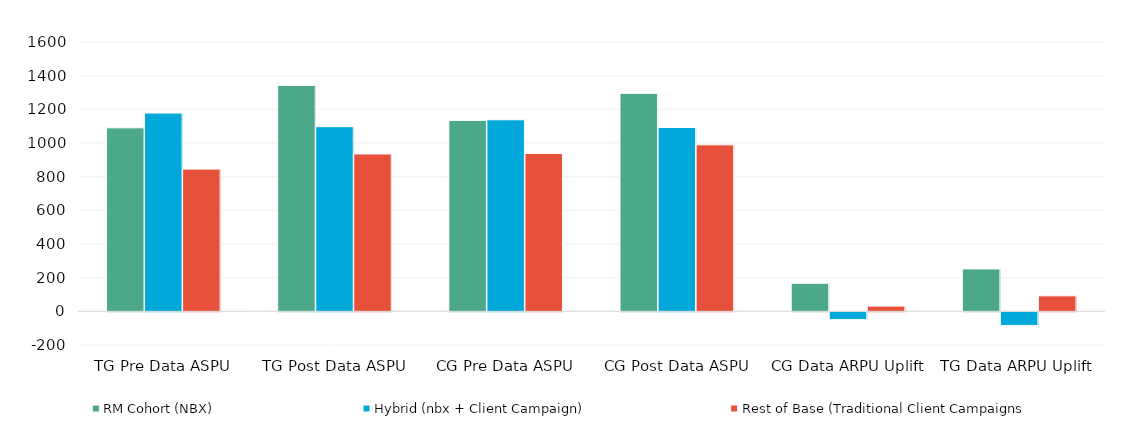
| Category | RM Cohort (NBX)  | Hybrid (nbx + Client Campaign) | Rest of Base (Traditional Client Campaigns |
|---|---|---|---|
| TG Pre Data ASPU | 1090 | 1178 | 845 |
| TG Post Data ASPU | 1342 | 1097 | 935 |
| CG Pre Data ASPU | 1134 | 1138 | 938 |
| CG Post Data ASPU | 1295 | 1092 | 989 |
| CG Data ARPU Uplift | 167 | -46 | 31 |
| TG Data ARPU Uplift  | 252 | -81 | 92 |